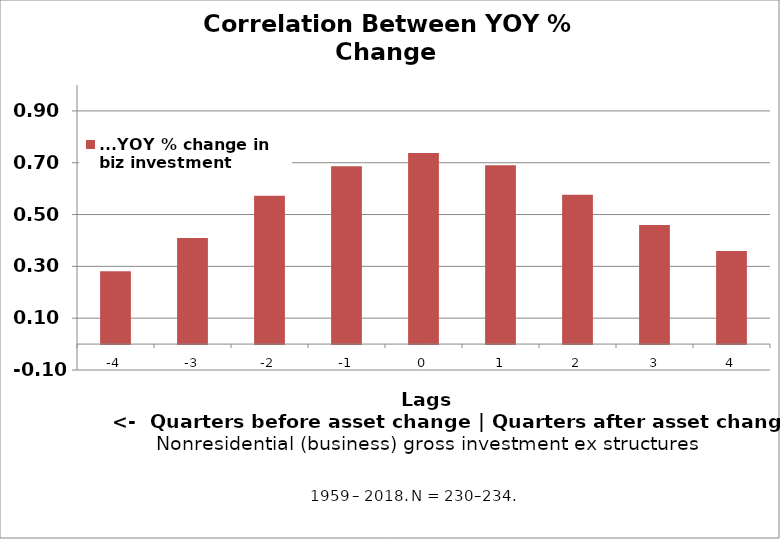
| Category | ...YOY % change in biz investment |
|---|---|
| -4.0 | 0.282 |
| -3.0 | 0.41 |
| -2.0 | 0.572 |
| -1.0 | 0.686 |
| 0.0 | 0.738 |
| 1.0 | 0.691 |
| 2.0 | 0.577 |
| 3.0 | 0.46 |
| 4.0 | 0.359 |